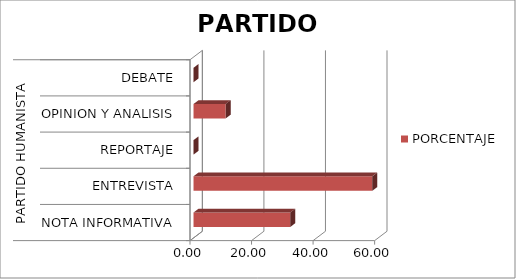
| Category | PORCENTAJE |
|---|---|
| 0 | 31.448 |
| 1 | 58.102 |
| 2 | 0 |
| 3 | 10.451 |
| 4 | 0 |